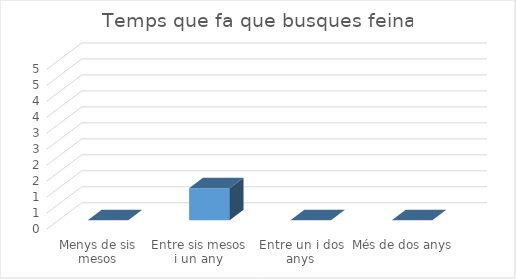
| Category | Series 0 |
|---|---|
| Menys de sis mesos | 0 |
| Entre sis mesos i un any | 1 |
| Entre un i dos anys | 0 |
| Més de dos anys | 0 |